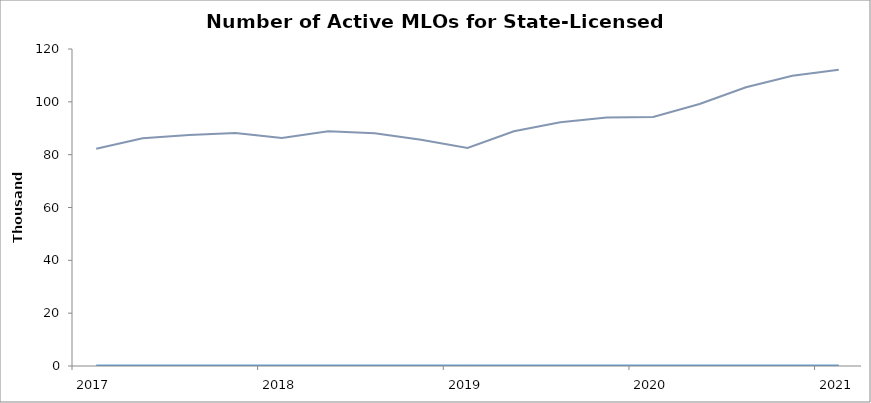
| Category | Quarter | Filing Quarter | Active MLOs |
|---|---|---|---|
| 2017 | 0 |  | 82276 |
| 2017 | 0 |  | 86190 |
| 2017 | 0 |  | 87405 |
| 2017 | 0 |  | 88205 |
| 2018 | 0 |  | 86269 |
| 2018 | 0 |  | 88855 |
| 2018 | 0 |  | 88147 |
| 2018 | 0 |  | 85647 |
| 2019 | 0 |  | 82551 |
| 2019 | 0 |  | 88830 |
| 2019 | 0 |  | 92237 |
| 2019 | 0 |  | 94058 |
| 2020 | 0 |  | 94243 |
| 2020 | 0 |  | 99191 |
| 2020 | 0 |  | 105504 |
| 2020 | 0 |  | 109875 |
| 2021 | 0 |  | 112158 |